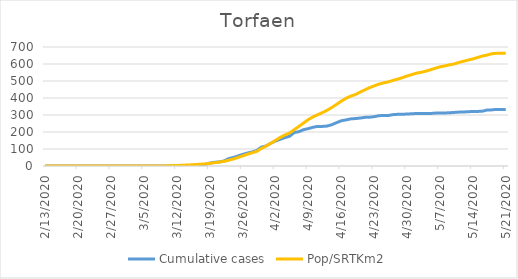
| Category | Cumulative cases | Pop/SRTKm2 |
|---|---|---|
| 5/21/20 | 333 | 663.781 |
| 5/20/20 | 333 | 663.781 |
| 5/19/20 | 333 | 663.626 |
| 5/18/20 | 330 | 659.987 |
| 5/17/20 | 329 | 652.243 |
| 5/16/20 | 322 | 646.474 |
| 5/15/20 | 321 | 638.365 |
| 5/14/20 | 321 | 629.374 |
| 5/13/20 | 319 | 623.136 |
| 5/12/20 | 318 | 615.964 |
| 5/11/20 | 317 | 608.843 |
| 5/10/20 | 315 | 600.007 |
| 5/9/20 | 313 | 594.862 |
| 5/8/20 | 312 | 588.417 |
| 5/7/20 | 312 | 583.219 |
| 5/6/20 | 311 | 574.643 |
| 5/5/20 | 309 | 566.067 |
| 5/4/20 | 309 | 557.803 |
| 5/3/20 | 309 | 551.15 |
| 5/2/20 | 309 | 546.264 |
| 5/1/20 | 307 | 537.584 |
| 4/30/20 | 306 | 529.372 |
| 4/29/20 | 304 | 519.393 |
| 4/28/20 | 304 | 510.921 |
| 4/27/20 | 302 | 503.333 |
| 4/26/20 | 297 | 494.809 |
| 4/25/20 | 297 | 488.623 |
| 4/24/20 | 296 | 481.607 |
| 4/23/20 | 290 | 470.848 |
| 4/22/20 | 287 | 460.557 |
| 4/21/20 | 286 | 447.511 |
| 4/20/20 | 282 | 434.361 |
| 4/19/20 | 279 | 420.067 |
| 4/18/20 | 277 | 410.816 |
| 4/17/20 | 271 | 398.186 |
| 4/16/20 | 266 | 381.45 |
| 4/15/20 | 255 | 362.79 |
| 4/14/20 | 243 | 344.339 |
| 4/13/20 | 235 | 328.226 |
| 4/12/20 | 233 | 314.349 |
| 4/11/20 | 233 | 301.719 |
| 4/10/20 | 228 | 289.037 |
| 4/9/20 | 220 | 273.444 |
| 4/8/20 | 214 | 253.174 |
| 4/7/20 | 202 | 233.267 |
| 4/6/20 | 197 | 213.724 |
| 4/5/20 | 175 | 194.025 |
| 4/4/20 | 167 | 182.539 |
| 4/3/20 | 157 | 167.933 |
| 4/2/20 | 147 | 151.093 |
| 4/1/20 | 134 | 133.785 |
| 3/31/20 | 118 | 117.153 |
| 3/30/20 | 111 | 103.068 |
| 3/29/20 | 91 | 85.708 |
| 3/28/20 | 82 | 77.6 |
| 3/27/20 | 76 | 68.972 |
| 3/26/20 | 68 | 59.356 |
| 3/25/20 | 59 | 50.312 |
| 3/24/20 | 50 | 40.801 |
| 3/23/20 | 43 | 33.784 |
| 3/22/20 | 29 | 27.027 |
| 3/21/20 | 24 | 23.077 |
| 3/20/20 | 22 | 19.179 |
| 3/19/20 | 17 | 15.437 |
| 3/18/20 | 9 | 12.318 |
| 3/17/20 | 6 | 10.499 |
| 3/16/20 | 4 | 8.576 |
| 3/15/20 | 3 | 6.809 |
| 3/14/20 | 2 | 5.302 |
| 3/13/20 | 2 | 4.314 |
| 3/12/20 | 0 | 2.911 |
| 3/11/20 | 0 | 1.663 |
| 3/10/20 | 0 | 0.936 |
| 3/9/20 | 0 | 0.364 |
| 3/8/20 | 0 | 0.208 |
| 3/7/20 | 0 | 0.208 |
| 3/6/20 | 0 | 0.104 |
| 3/5/20 | 0 | 0.104 |
| 3/4/20 | 0 | 0.104 |
| 3/3/20 | 0 | 0.052 |
| 3/2/20 | 0 | 0.052 |
| 3/1/20 | 0 | 0.052 |
| 2/29/20 | 0 | 0.052 |
| 2/28/20 | 0 | 0.052 |
| 2/27/20 | 0 | 0.052 |
| 2/26/20 | 0 | 0 |
| 2/25/20 | 0 | 0 |
| 2/24/20 | 0 | 0 |
| 2/23/20 | 0 | 0 |
| 2/22/20 | 0 | 0 |
| 2/21/20 | 0 | 0 |
| 2/20/20 | 0 | 0 |
| 2/19/20 | 0 | 0 |
| 2/18/20 | 0 | 0 |
| 2/17/20 | 0 | 0 |
| 2/16/20 | 0 | 0 |
| 2/15/20 | 0 | 0 |
| 2/14/20 | 0 | 0 |
| 2/13/20 | 0 | 0 |